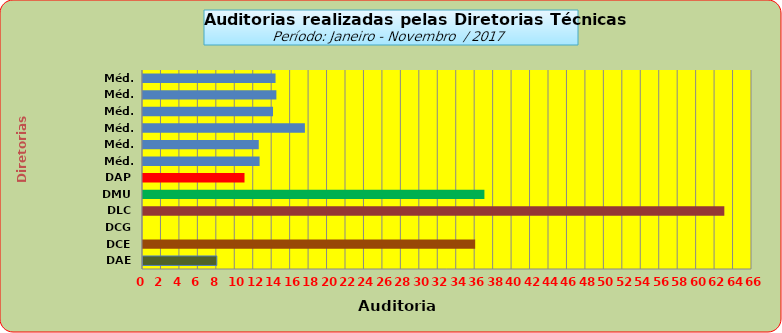
| Category | Series 0 |
|---|---|
| DAE | 8 |
| DCE | 36 |
| DCG | 0 |
| DLC | 63 |
| DMU | 37 |
| DAP | 11 |
| Méd. 2011 | 12.636 |
| Méd. 2012 | 12.545 |
| Méd. 2013 | 17.545 |
| Méd. 2014 | 14.091 |
| Méd. 2015 | 14.455 |
| Méd. 2016 | 14.364 |